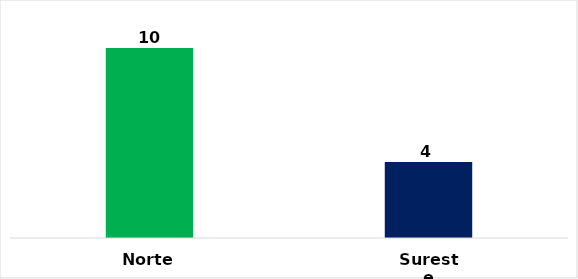
| Category | Total |
|---|---|
| Norte | 10 |
| Sureste | 4 |